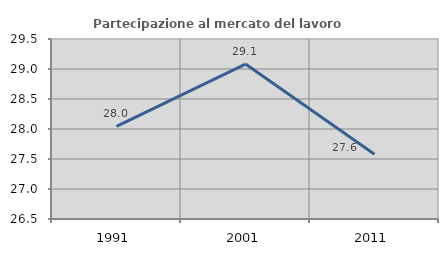
| Category | Partecipazione al mercato del lavoro  femminile |
|---|---|
| 1991.0 | 28.045 |
| 2001.0 | 29.082 |
| 2011.0 | 27.578 |